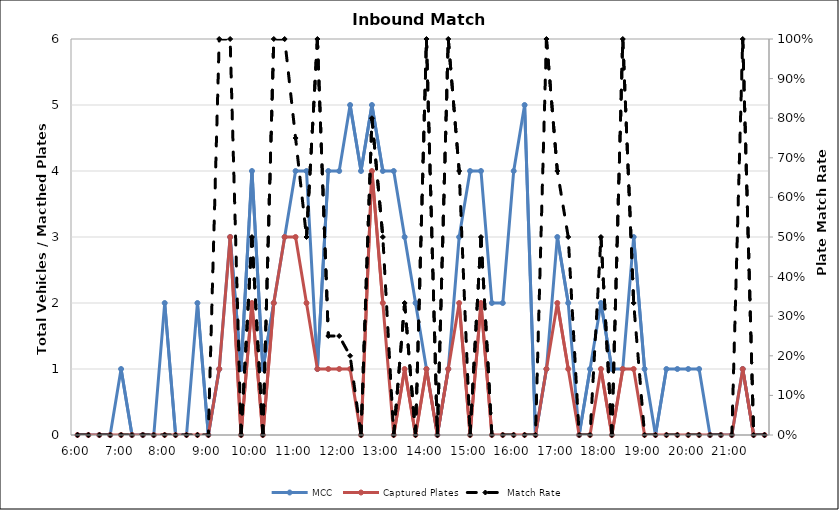
| Category | MCC | Captured Plates |
|---|---|---|
| 0.25 | 0 | 0 |
| 0.260416666666667 | 0 | 0 |
| 0.270833333333333 | 0 | 0 |
| 0.28125 | 0 | 0 |
| 0.291666666666667 | 1 | 0 |
| 0.302083333333333 | 0 | 0 |
| 0.3125 | 0 | 0 |
| 0.322916666666667 | 0 | 0 |
| 0.333333333333333 | 2 | 0 |
| 0.34375 | 0 | 0 |
| 0.354166666666667 | 0 | 0 |
| 0.364583333333333 | 2 | 0 |
| 0.375 | 0 | 0 |
| 0.385416666666667 | 1 | 1 |
| 0.395833333333333 | 3 | 3 |
| 0.40625 | 1 | 0 |
| 0.416666666666667 | 4 | 2 |
| 0.427083333333333 | 1 | 0 |
| 0.4375 | 2 | 2 |
| 0.447916666666667 | 3 | 3 |
| 0.458333333333333 | 4 | 3 |
| 0.46875 | 4 | 2 |
| 0.479166666666667 | 1 | 1 |
| 0.489583333333333 | 4 | 1 |
| 0.5 | 4 | 1 |
| 0.510416666666667 | 5 | 1 |
| 0.520833333333333 | 4 | 0 |
| 0.53125 | 5 | 4 |
| 0.541666666666667 | 4 | 2 |
| 0.552083333333333 | 4 | 0 |
| 0.5625 | 3 | 1 |
| 0.572916666666667 | 2 | 0 |
| 0.583333333333333 | 1 | 1 |
| 0.59375 | 0 | 0 |
| 0.604166666666667 | 1 | 1 |
| 0.614583333333333 | 3 | 2 |
| 0.625 | 4 | 0 |
| 0.635416666666667 | 4 | 2 |
| 0.645833333333333 | 2 | 0 |
| 0.65625 | 2 | 0 |
| 0.666666666666667 | 4 | 0 |
| 0.677083333333333 | 5 | 0 |
| 0.6875 | 0 | 0 |
| 0.697916666666667 | 1 | 1 |
| 0.708333333333333 | 3 | 2 |
| 0.71875 | 2 | 1 |
| 0.729166666666667 | 0 | 0 |
| 0.739583333333333 | 1 | 0 |
| 0.75 | 2 | 1 |
| 0.760416666666667 | 1 | 0 |
| 0.770833333333333 | 1 | 1 |
| 0.78125 | 3 | 1 |
| 0.791666666666667 | 1 | 0 |
| 0.802083333333333 | 0 | 0 |
| 0.8125 | 1 | 0 |
| 0.822916666666667 | 1 | 0 |
| 0.833333333333333 | 1 | 0 |
| 0.84375 | 1 | 0 |
| 0.854166666666667 | 0 | 0 |
| 0.864583333333333 | 0 | 0 |
| 0.875 | 0 | 0 |
| 0.885416666666667 | 1 | 1 |
| 0.895833333333333 | 0 | 0 |
| 0.90625 | 0 | 0 |